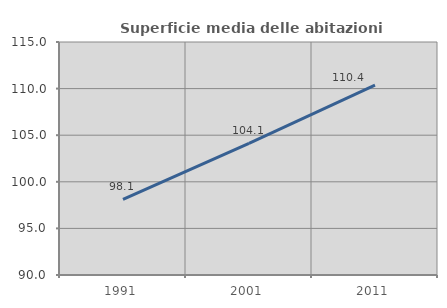
| Category | Superficie media delle abitazioni occupate |
|---|---|
| 1991.0 | 98.11 |
| 2001.0 | 104.117 |
| 2011.0 | 110.371 |